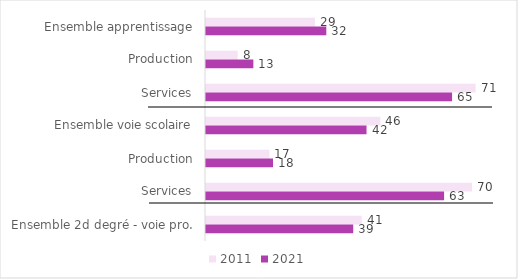
| Category | 2011 | 2021 |
|---|---|---|
| Ensemble apprentissage | 28.762 | 31.762 |
| Production | 8.361 | 12.506 |
| Services | 71.183 | 64.965 |
| Ensemble voie scolaire | 46.006 | 42.382 |
| Production | 16.764 | 17.69 |
| Services | 70.225 | 62.861 |
| Ensemble 2d degré - voie pro. | 41.124 | 38.873 |